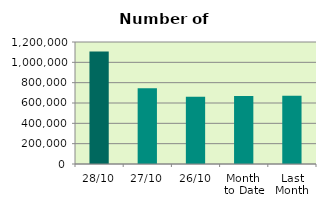
| Category | Series 0 |
|---|---|
| 28/10 | 1106620 |
| 27/10 | 745094 |
| 26/10 | 661354 |
| Month 
to Date | 668868.6 |
| Last
Month | 670189.636 |